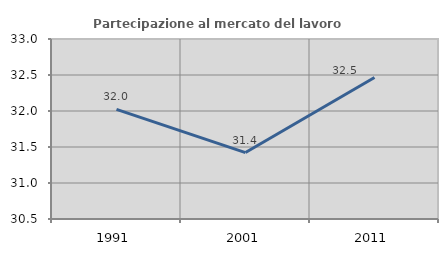
| Category | Partecipazione al mercato del lavoro  femminile |
|---|---|
| 1991.0 | 32.022 |
| 2001.0 | 31.423 |
| 2011.0 | 32.466 |